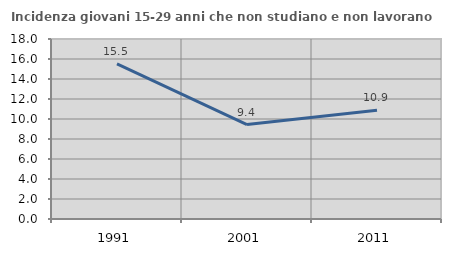
| Category | Incidenza giovani 15-29 anni che non studiano e non lavorano  |
|---|---|
| 1991.0 | 15.517 |
| 2001.0 | 9.445 |
| 2011.0 | 10.878 |